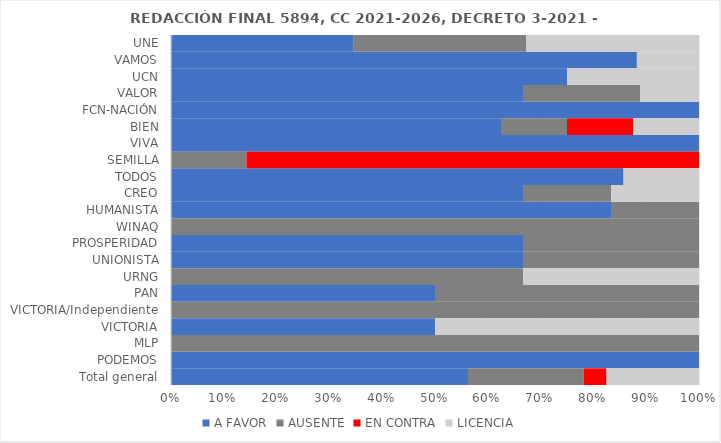
| Category | A FAVOR | AUSENTE | EN CONTRA | LICENCIA |
|---|---|---|---|---|
| UNE | 0.346 | 0.327 | 0 | 0.327 |
| VAMOS | 0.882 | 0 | 0 | 0.118 |
| UCN | 0.75 | 0 | 0 | 0.25 |
| VALOR | 0.667 | 0.222 | 0 | 0.111 |
| FCN-NACIÓN | 1 | 0 | 0 | 0 |
| BIEN | 0.625 | 0.125 | 0.125 | 0.125 |
| VIVA | 1 | 0 | 0 | 0 |
| SEMILLA | 0 | 0.143 | 0.857 | 0 |
| TODOS | 0.857 | 0 | 0 | 0.143 |
| CREO | 0.667 | 0.167 | 0 | 0.167 |
| HUMANISTA | 0.833 | 0.167 | 0 | 0 |
| WINAQ | 0 | 1 | 0 | 0 |
| PROSPERIDAD | 0.667 | 0.333 | 0 | 0 |
| UNIONISTA | 0.667 | 0.333 | 0 | 0 |
| URNG | 0 | 0.667 | 0 | 0.333 |
| PAN | 0.5 | 0.5 | 0 | 0 |
| VICTORIA/Independiente | 0 | 1 | 0 | 0 |
| VICTORIA | 0.5 | 0 | 0 | 0.5 |
| MLP | 0 | 1 | 0 | 0 |
| PODEMOS | 1 | 0 | 0 | 0 |
| Total general | 0.562 | 0.219 | 0.044 | 0.175 |